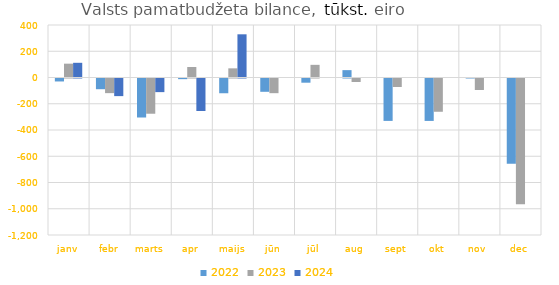
| Category | 2022 | 2023 | 2024 |
|---|---|---|---|
| janv | -22576.613 | 105353.718 | 111979.605 |
| febr | -81631.044 | -111573.897 | -134250.835 |
| marts | -297136.226 | -268446.374 | -103808.377 |
| apr | -5088.903 | 80162.835 | -247654.1 |
| maijs | -112366.131 | 69722.715 | 329094.828 |
| jūn | -101334.812 | -111818.831 | 0 |
| jūl | -31986.255 | 96437.577 | 0 |
| aug | 56068.97 | -26561.409 | 0 |
| sept | -323095.809 | -64729.897 | 0 |
| okt | -323290.39 | -253457.177 | 0 |
| nov | 2508.419 | -87529.517 | 0 |
| dec | -649319.296 | -958560.445 | 0 |